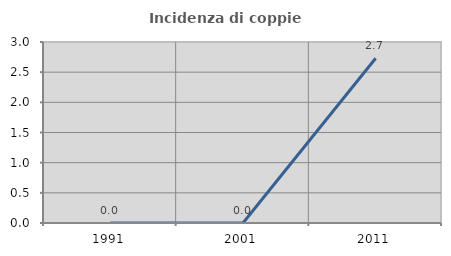
| Category | Incidenza di coppie miste |
|---|---|
| 1991.0 | 0 |
| 2001.0 | 0 |
| 2011.0 | 2.73 |